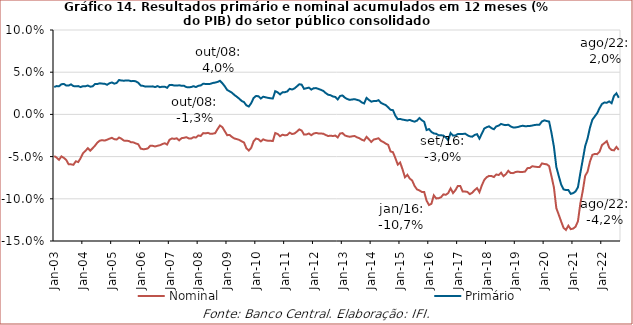
| Category | Nominal | Primário |
|---|---|---|
| 2003-01-01 | -0.049 | 0.032 |
| 2003-02-01 | -0.051 | 0.034 |
| 2003-03-01 | -0.054 | 0.033 |
| 2003-04-01 | -0.05 | 0.036 |
| 2003-05-01 | -0.051 | 0.036 |
| 2003-06-01 | -0.054 | 0.034 |
| 2003-07-01 | -0.059 | 0.034 |
| 2003-08-01 | -0.059 | 0.036 |
| 2003-09-01 | -0.06 | 0.034 |
| 2003-10-01 | -0.056 | 0.033 |
| 2003-11-01 | -0.056 | 0.034 |
| 2003-12-01 | -0.052 | 0.032 |
| 2004-01-01 | -0.046 | 0.033 |
| 2004-02-01 | -0.043 | 0.033 |
| 2004-03-01 | -0.04 | 0.034 |
| 2004-04-01 | -0.043 | 0.033 |
| 2004-05-01 | -0.04 | 0.033 |
| 2004-06-01 | -0.037 | 0.036 |
| 2004-07-01 | -0.033 | 0.036 |
| 2004-08-01 | -0.031 | 0.037 |
| 2004-09-01 | -0.031 | 0.036 |
| 2004-10-01 | -0.031 | 0.036 |
| 2004-11-01 | -0.03 | 0.035 |
| 2004-12-01 | -0.029 | 0.037 |
| 2005-01-01 | -0.028 | 0.038 |
| 2005-02-01 | -0.029 | 0.036 |
| 2005-03-01 | -0.03 | 0.037 |
| 2005-04-01 | -0.027 | 0.041 |
| 2005-05-01 | -0.029 | 0.04 |
| 2005-06-01 | -0.031 | 0.04 |
| 2005-07-01 | -0.031 | 0.04 |
| 2005-08-01 | -0.031 | 0.04 |
| 2005-09-01 | -0.033 | 0.039 |
| 2005-10-01 | -0.033 | 0.04 |
| 2005-11-01 | -0.034 | 0.039 |
| 2005-12-01 | -0.035 | 0.037 |
| 2006-01-01 | -0.041 | 0.034 |
| 2006-02-01 | -0.041 | 0.034 |
| 2006-03-01 | -0.041 | 0.033 |
| 2006-04-01 | -0.04 | 0.033 |
| 2006-05-01 | -0.037 | 0.033 |
| 2006-06-01 | -0.037 | 0.033 |
| 2006-07-01 | -0.038 | 0.032 |
| 2006-08-01 | -0.037 | 0.034 |
| 2006-09-01 | -0.037 | 0.032 |
| 2006-10-01 | -0.035 | 0.033 |
| 2006-11-01 | -0.034 | 0.033 |
| 2006-12-01 | -0.036 | 0.032 |
| 2007-01-01 | -0.03 | 0.035 |
| 2007-02-01 | -0.028 | 0.035 |
| 2007-03-01 | -0.029 | 0.034 |
| 2007-04-01 | -0.028 | 0.034 |
| 2007-05-01 | -0.031 | 0.034 |
| 2007-06-01 | -0.028 | 0.034 |
| 2007-07-01 | -0.028 | 0.034 |
| 2007-08-01 | -0.027 | 0.032 |
| 2007-09-01 | -0.028 | 0.032 |
| 2007-10-01 | -0.029 | 0.032 |
| 2007-11-01 | -0.027 | 0.033 |
| 2007-12-01 | -0.027 | 0.032 |
| 2008-01-01 | -0.025 | 0.034 |
| 2008-02-01 | -0.026 | 0.034 |
| 2008-03-01 | -0.022 | 0.036 |
| 2008-04-01 | -0.022 | 0.036 |
| 2008-05-01 | -0.022 | 0.036 |
| 2008-06-01 | -0.023 | 0.036 |
| 2008-07-01 | -0.023 | 0.037 |
| 2008-08-01 | -0.022 | 0.038 |
| 2008-09-01 | -0.017 | 0.039 |
| 2008-10-01 | -0.013 | 0.04 |
| 2008-11-01 | -0.015 | 0.037 |
| 2008-12-01 | -0.02 | 0.033 |
| 2009-01-01 | -0.025 | 0.029 |
| 2009-02-01 | -0.024 | 0.027 |
| 2009-03-01 | -0.027 | 0.026 |
| 2009-04-01 | -0.029 | 0.023 |
| 2009-05-01 | -0.029 | 0.021 |
| 2009-06-01 | -0.03 | 0.019 |
| 2009-07-01 | -0.032 | 0.016 |
| 2009-08-01 | -0.033 | 0.015 |
| 2009-09-01 | -0.04 | 0.011 |
| 2009-10-01 | -0.043 | 0.009 |
| 2009-11-01 | -0.04 | 0.013 |
| 2009-12-01 | -0.032 | 0.019 |
| 2010-01-01 | -0.029 | 0.022 |
| 2010-02-01 | -0.029 | 0.022 |
| 2010-03-01 | -0.032 | 0.019 |
| 2010-04-01 | -0.03 | 0.021 |
| 2010-05-01 | -0.031 | 0.02 |
| 2010-06-01 | -0.031 | 0.02 |
| 2010-07-01 | -0.031 | 0.019 |
| 2010-08-01 | -0.032 | 0.019 |
| 2010-09-01 | -0.022 | 0.028 |
| 2010-10-01 | -0.023 | 0.026 |
| 2010-11-01 | -0.026 | 0.024 |
| 2010-12-01 | -0.024 | 0.026 |
| 2011-01-01 | -0.025 | 0.026 |
| 2011-02-01 | -0.024 | 0.027 |
| 2011-03-01 | -0.022 | 0.03 |
| 2011-04-01 | -0.023 | 0.029 |
| 2011-05-01 | -0.023 | 0.031 |
| 2011-06-01 | -0.02 | 0.033 |
| 2011-07-01 | -0.018 | 0.036 |
| 2011-08-01 | -0.019 | 0.035 |
| 2011-09-01 | -0.024 | 0.03 |
| 2011-10-01 | -0.024 | 0.031 |
| 2011-11-01 | -0.023 | 0.032 |
| 2011-12-01 | -0.025 | 0.029 |
| 2012-01-01 | -0.023 | 0.031 |
| 2012-02-01 | -0.022 | 0.031 |
| 2012-03-01 | -0.023 | 0.03 |
| 2012-04-01 | -0.023 | 0.029 |
| 2012-05-01 | -0.023 | 0.028 |
| 2012-06-01 | -0.024 | 0.025 |
| 2012-07-01 | -0.026 | 0.023 |
| 2012-08-01 | -0.025 | 0.023 |
| 2012-09-01 | -0.026 | 0.021 |
| 2012-10-01 | -0.025 | 0.021 |
| 2012-11-01 | -0.027 | 0.018 |
| 2012-12-01 | -0.023 | 0.022 |
| 2013-01-01 | -0.022 | 0.022 |
| 2013-02-01 | -0.025 | 0.02 |
| 2013-03-01 | -0.026 | 0.018 |
| 2013-04-01 | -0.026 | 0.017 |
| 2013-05-01 | -0.026 | 0.018 |
| 2013-06-01 | -0.026 | 0.018 |
| 2013-07-01 | -0.027 | 0.017 |
| 2013-08-01 | -0.028 | 0.016 |
| 2013-09-01 | -0.03 | 0.014 |
| 2013-10-01 | -0.031 | 0.013 |
| 2013-11-01 | -0.027 | 0.02 |
| 2013-12-01 | -0.03 | 0.017 |
| 2014-01-01 | -0.033 | 0.015 |
| 2014-02-01 | -0.03 | 0.016 |
| 2014-03-01 | -0.029 | 0.016 |
| 2014-04-01 | -0.028 | 0.017 |
| 2014-05-01 | -0.031 | 0.014 |
| 2014-06-01 | -0.033 | 0.012 |
| 2014-07-01 | -0.035 | 0.011 |
| 2014-08-01 | -0.036 | 0.008 |
| 2014-09-01 | -0.044 | 0.005 |
| 2014-10-01 | -0.045 | 0.005 |
| 2014-11-01 | -0.052 | -0.002 |
| 2014-12-01 | -0.06 | -0.006 |
| 2015-01-01 | -0.057 | -0.005 |
| 2015-02-01 | -0.065 | -0.006 |
| 2015-03-01 | -0.074 | -0.007 |
| 2015-04-01 | -0.072 | -0.007 |
| 2015-05-01 | -0.076 | -0.007 |
| 2015-06-01 | -0.078 | -0.008 |
| 2015-07-01 | -0.085 | -0.009 |
| 2015-08-01 | -0.089 | -0.007 |
| 2015-09-01 | -0.09 | -0.004 |
| 2015-10-01 | -0.092 | -0.007 |
| 2015-11-01 | -0.092 | -0.009 |
| 2015-12-01 | -0.102 | -0.019 |
| 2016-01-01 | -0.107 | -0.017 |
| 2016-02-01 | -0.106 | -0.021 |
| 2016-03-01 | -0.096 | -0.023 |
| 2016-04-01 | -0.1 | -0.023 |
| 2016-05-01 | -0.099 | -0.025 |
| 2016-06-01 | -0.098 | -0.025 |
| 2016-07-01 | -0.095 | -0.025 |
| 2016-08-01 | -0.095 | -0.027 |
| 2016-09-01 | -0.093 | -0.03 |
| 2016-10-01 | -0.088 | -0.022 |
| 2016-11-01 | -0.093 | -0.025 |
| 2016-12-01 | -0.09 | -0.025 |
| 2017-01-01 | -0.085 | -0.023 |
| 2017-02-01 | -0.085 | -0.023 |
| 2017-03-01 | -0.091 | -0.023 |
| 2017-04-01 | -0.091 | -0.023 |
| 2017-05-01 | -0.092 | -0.025 |
| 2017-06-01 | -0.095 | -0.026 |
| 2017-07-01 | -0.093 | -0.026 |
| 2017-08-01 | -0.09 | -0.024 |
| 2017-09-01 | -0.087 | -0.023 |
| 2017-10-01 | -0.092 | -0.029 |
| 2017-11-01 | -0.084 | -0.023 |
| 2017-12-01 | -0.078 | -0.017 |
| 2018-01-01 | -0.074 | -0.015 |
| 2018-02-01 | -0.073 | -0.014 |
| 2018-03-01 | -0.073 | -0.016 |
| 2018-04-01 | -0.074 | -0.018 |
| 2018-05-01 | -0.071 | -0.014 |
| 2018-06-01 | -0.072 | -0.013 |
| 2018-07-01 | -0.069 | -0.011 |
| 2018-08-01 | -0.073 | -0.012 |
| 2018-09-01 | -0.071 | -0.013 |
| 2018-10-01 | -0.067 | -0.012 |
| 2018-11-01 | -0.069 | -0.014 |
| 2018-12-01 | -0.07 | -0.015 |
| 2019-01-01 | -0.068 | -0.015 |
| 2019-02-01 | -0.068 | -0.015 |
| 2019-03-01 | -0.068 | -0.014 |
| 2019-04-01 | -0.068 | -0.013 |
| 2019-05-01 | -0.068 | -0.014 |
| 2019-06-01 | -0.064 | -0.014 |
| 2019-07-01 | -0.063 | -0.014 |
| 2019-08-01 | -0.061 | -0.013 |
| 2019-09-01 | -0.062 | -0.013 |
| 2019-10-01 | -0.062 | -0.012 |
| 2019-11-01 | -0.062 | -0.012 |
| 2019-12-01 | -0.058 | -0.008 |
| 2020-01-01 | -0.059 | -0.007 |
| 2020-02-01 | -0.059 | -0.008 |
| 2020-03-01 | -0.061 | -0.008 |
| 2020-04-01 | -0.074 | -0.022 |
| 2020-05-01 | -0.087 | -0.038 |
| 2020-06-01 | -0.111 | -0.062 |
| 2020-07-01 | -0.119 | -0.073 |
| 2020-08-01 | -0.127 | -0.083 |
| 2020-09-01 | -0.134 | -0.089 |
| 2020-10-01 | -0.137 | -0.09 |
| 2020-11-01 | -0.132 | -0.09 |
| 2020-12-01 | -0.136 | -0.094 |
| 2021-01-01 | -0.135 | -0.093 |
| 2021-02-01 | -0.133 | -0.091 |
| 2021-03-01 | -0.127 | -0.086 |
| 2021-04-01 | -0.105 | -0.069 |
| 2021-05-01 | -0.091 | -0.054 |
| 2021-06-01 | -0.073 | -0.038 |
| 2021-07-01 | -0.068 | -0.029 |
| 2021-08-01 | -0.056 | -0.016 |
| 2021-09-01 | -0.048 | -0.006 |
| 2021-10-01 | -0.047 | -0.002 |
| 2021-11-01 | -0.047 | 0.001 |
| 2021-12-01 | -0.044 | 0.007 |
| 2022-01-01 | -0.036 | 0.012 |
| 2022-02-01 | -0.034 | 0.014 |
| 2022-03-01 | -0.032 | 0.014 |
| 2022-04-01 | -0.039 | 0.015 |
| 2022-05-01 | -0.042 | 0.013 |
| 2022-06-01 | -0.043 | 0.022 |
| 2022-07-01 | -0.039 | 0.025 |
| 2022-08-01 | -0.042 | 0.02 |